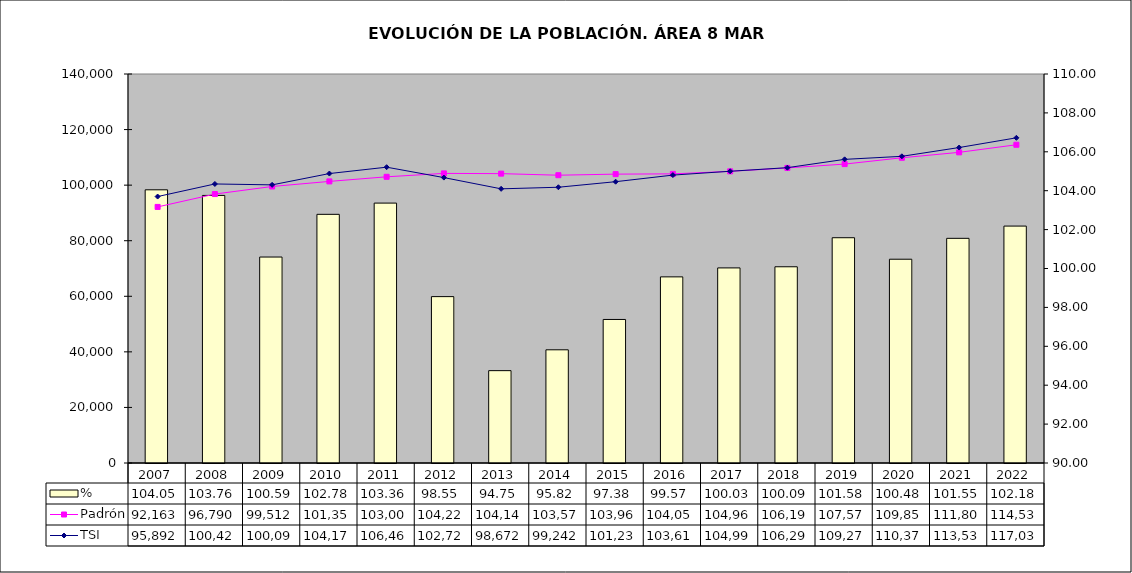
| Category | % |
|---|---|
| 2007.0 | 104.046 |
| 2008.0 | 103.757 |
| 2009.0 | 100.589 |
| 2010.0 | 102.784 |
| 2011.0 | 103.362 |
| 2012.0 | 98.554 |
| 2013.0 | 94.748 |
| 2014.0 | 95.82 |
| 2015.0 | 97.38 |
| 2016.0 | 99.57 |
| 2017.0 | 100.03 |
| 2018.0 | 100.089 |
| 2019.0 | 101.582 |
| 2020.0 | 100.477 |
| 2021.0 | 101.551 |
| 2022.0 | 102.181 |